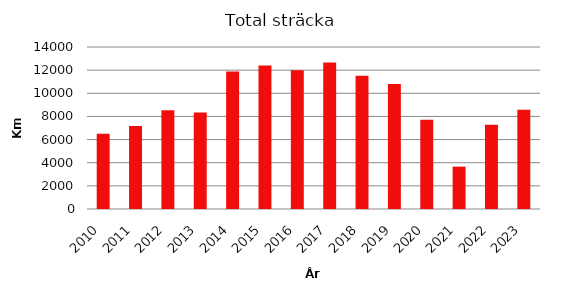
| Category | Series 0 |
|---|---|
| 2010.0 | 6500 |
| 2011.0 | 7168 |
| 2012.0 | 8542 |
| 2013.0 | 8337 |
| 2014.0 | 11892 |
| 2015.0 | 12397 |
| 2016.0 | 11989 |
| 2017.0 | 12657 |
| 2018.0 | 11522 |
| 2019.0 | 10801 |
| 2020.0 | 7719 |
| 2021.0 | 3662 |
| 2022.0 | 7288 |
| 2023.0 | 8585 |